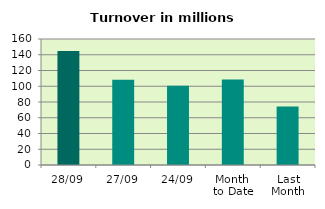
| Category | Series 0 |
|---|---|
| 28/09 | 144.777 |
| 27/09 | 108.321 |
| 24/09 | 100.55 |
| Month 
to Date | 108.705 |
| Last
Month | 74.221 |